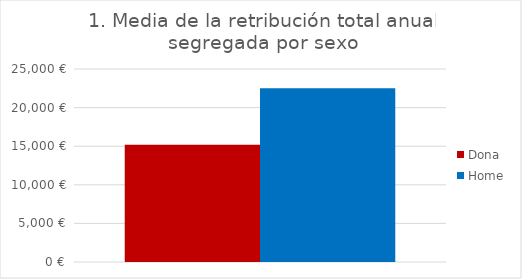
| Category | Dona | Home |
|---|---|---|
| Total | 15177.827 | 22519.231 |